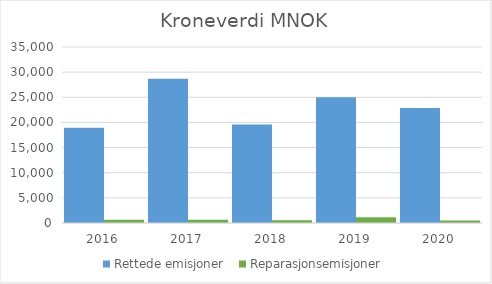
| Category | Rettede emisjoner  | Reparasjonsemisjoner |
|---|---|---|
| 2016.0 | 18960 | 667 |
| 2017.0 | 28687 | 648 |
| 2018.0 | 19567 | 555 |
| 2019.0 | 25004 | 1149 |
| 2020.0 | 22855 | 487 |